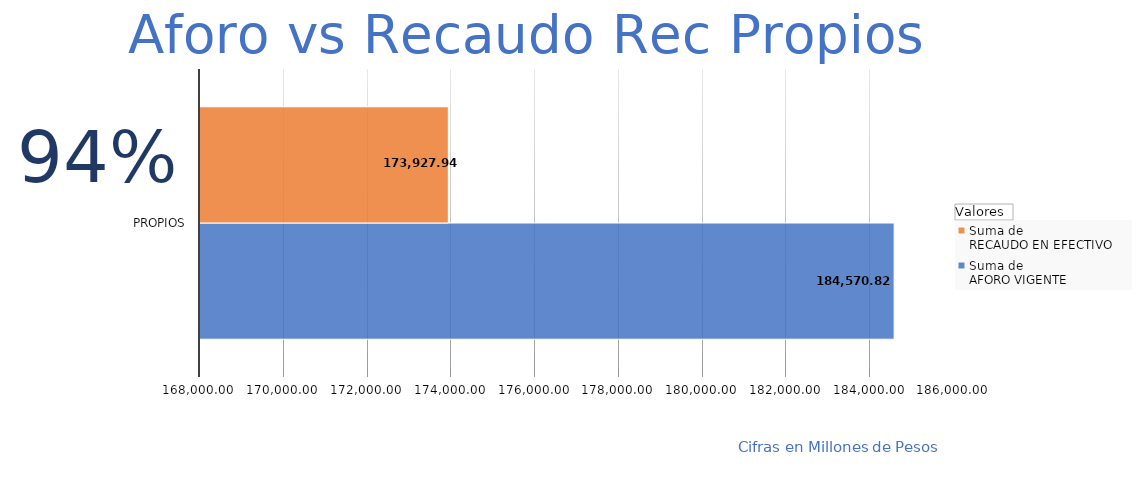
| Category | Suma de 
AFORO VIGENTE
 | Suma de 
RECAUDO EN EFECTIVO 
 |
|---|---|---|
| Propios | 184570.824 | 173927.939 |